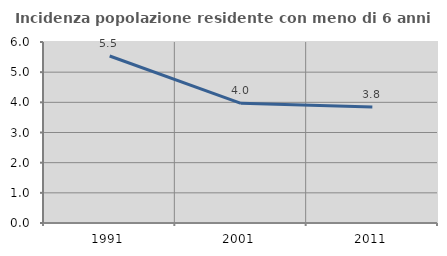
| Category | Incidenza popolazione residente con meno di 6 anni |
|---|---|
| 1991.0 | 5.537 |
| 2001.0 | 3.968 |
| 2011.0 | 3.846 |